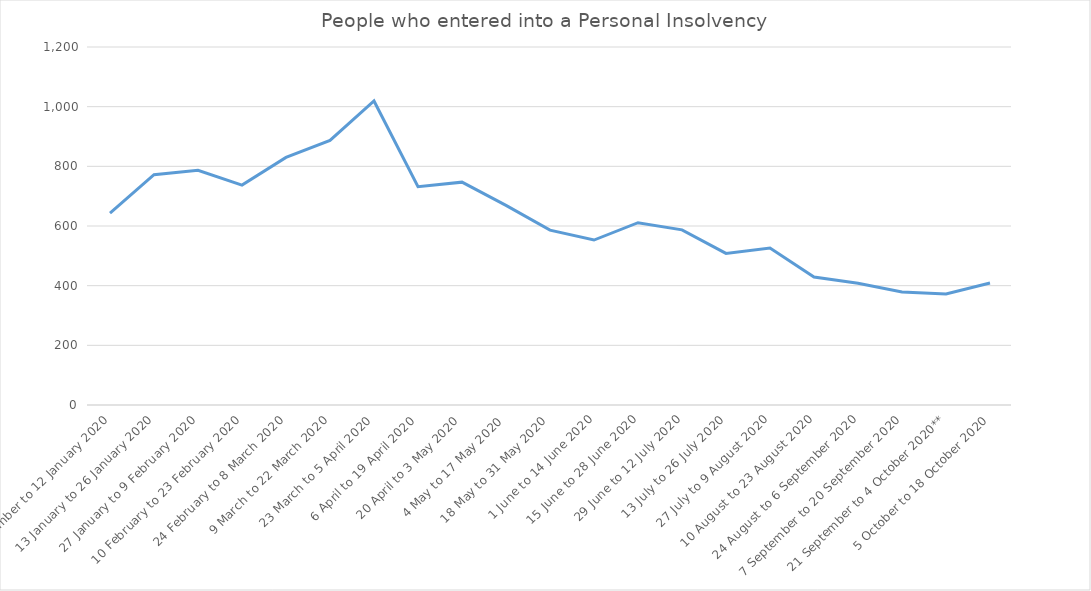
| Category | People who entered into a Personal Insolvency  |
|---|---|
| 30 December to 12 January 2020 | 643 |
| 13 January to 26 January 2020 | 772 |
| 27 January to 9 February 2020 | 787 |
| 10 February to 23 February 2020 | 737 |
| 24 February to 8 March 2020 | 830 |
| 9 March to 22 March 2020 | 887 |
| 23 March to 5 April 2020 | 1019 |
| 6 April to 19 April 2020 | 732 |
| 20 April to 3 May 2020 | 747 |
| 4 May to 17 May 2020 | 669 |
| 18 May to 31 May 2020 | 586 |
| 1 June to 14 June 2020 | 553 |
| 15 June to 28 June 2020 | 611 |
| 29 June to 12 July 2020 | 587 |
| 13 July to 26 July 2020 | 508 |
| 27 July to 9 August 2020 | 526 |
| 10 August to 23 August 2020 | 429 |
| 24 August to 6 September 2020 | 408 |
| 7 September to 20 September 2020 | 379 |
| 21 September to 4 October 2020** | 372 |
| 5 October to 18 October 2020 | 409 |